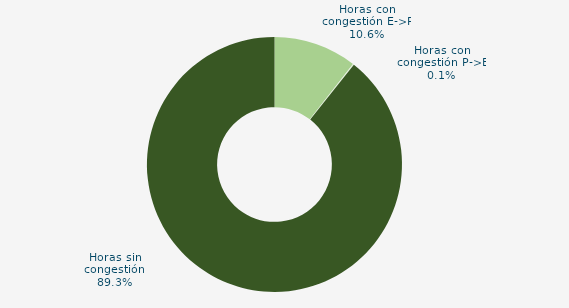
| Category | Horas con congestión E->P |
|---|---|
| Horas con congestión E->P | 10.556 |
| Horas con congestión P->E | 0.139 |
| Horas sin congestión | 89.306 |